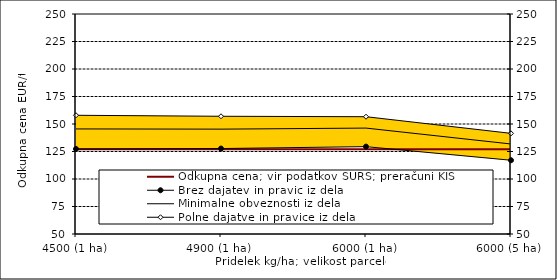
| Category | Odkupna cena; vir podatkov SURS; preračuni KIS |
|---|---|
| 4500 (1 ha) | 127 |
| 4900 (1 ha) | 127 |
| 6000 (1 ha) | 127 |
| 6000 (5 ha) | 127 |